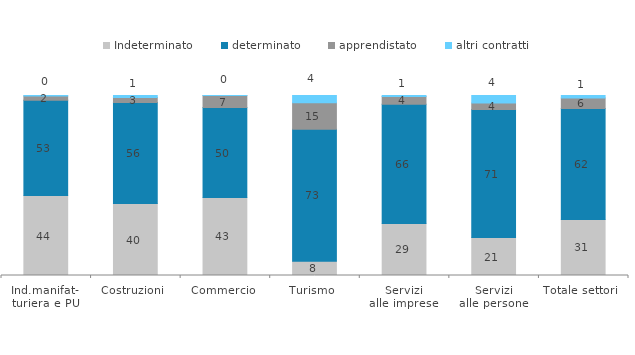
| Category | Indeterminato | determinato | apprendistato | altri contratti |
|---|---|---|---|---|
| Ind.manifat-
turiera e PU | 44.403 | 52.965 | 2.335 | 0.297 |
| Costruzioni | 39.949 | 56.163 | 2.845 | 1.043 |
| Commercio | 43.35 | 49.938 | 6.681 | 0.031 |
| Turismo | 7.942 | 73.355 | 14.684 | 4.019 |
| Servizi
alle imprese | 28.921 | 66.23 | 4.321 | 0.528 |
| Servizi
alle persone | 21.045 | 71.17 | 3.566 | 4.219 |
| Totale settori | 31.136 | 61.65 | 5.776 | 1.437 |